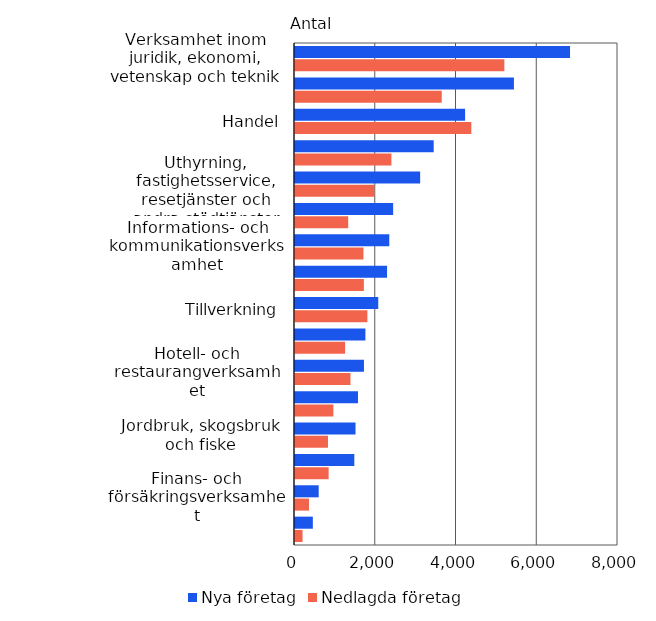
| Category | Nya företag | Nedlagda företag |
|---|---|---|
| Verksamhet inom juridik, ekonomi, vetenskap och teknik | 6812 | 5185 |
| Byggverksamhet | 5422 | 3635 |
| Handel | 4213 | 4367 |
| Annan serviceverksamhet | 3435 | 2388 |
| Uthyrning, fastighetsservice, resetjänster och andra stödtjänster | 3100 | 1965 |
| Kultur, nöje och fritid | 2431 | 1318 |
| Informations- och kommunikationsverksamhet | 2335 | 1695 |
| Transport och magasinering | 2280 | 1706 |
| Tillverkning | 2062 | 1793 |
| Vård och omsorg: sociala tjänster | 1744 | 1241 |
| Hotell- och restaurangverksamhet | 1708 | 1374 |
| Fastighetsverksamhet | 1560 | 950 |
| Jordbruk, skogsbruk och fiske | 1499 | 817 |
| Utbildning | 1469 | 833 |
| Finans- och försäkringsverksamhet | 587 | 347 |
| Övriga | 442 | 187 |